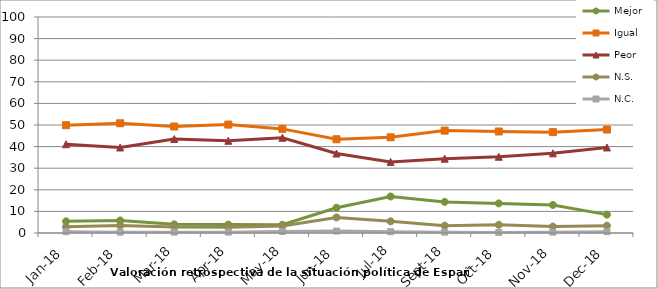
| Category | Mejor | Igual | Peor | N.S. | N.C. |
|---|---|---|---|---|---|
| 2018-01-01 | 5.4 | 49.9 | 41.1 | 2.9 | 0.6 |
| 2018-02-01 | 5.8 | 50.8 | 39.6 | 3.5 | 0.4 |
| 2018-03-01 | 4 | 49.3 | 43.5 | 2.8 | 0.4 |
| 2018-04-01 | 3.9 | 50.2 | 42.7 | 2.7 | 0.4 |
| 2018-05-01 | 3.8 | 48.2 | 44.1 | 3.2 | 0.7 |
| 2018-06-01 | 11.7 | 43.4 | 36.8 | 7.2 | 0.9 |
| 2018-07-01 | 16.9 | 44.3 | 32.9 | 5.4 | 0.6 |
| 2018-09-01 | 14.4 | 47.4 | 34.4 | 3.4 | 0.4 |
| 2018-10-01 | 13.7 | 47 | 35.3 | 3.8 | 0.2 |
| 2018-11-01 | 13 | 46.7 | 36.9 | 3 | 0.4 |
| 2018-12-01 | 8.5 | 47.9 | 39.6 | 3.4 | 0.6 |